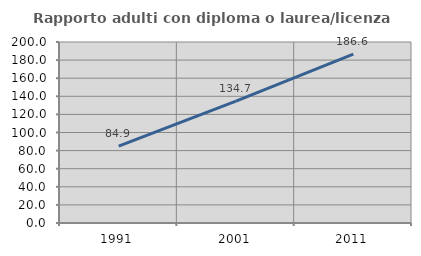
| Category | Rapporto adulti con diploma o laurea/licenza media  |
|---|---|
| 1991.0 | 84.89 |
| 2001.0 | 134.679 |
| 2011.0 | 186.609 |